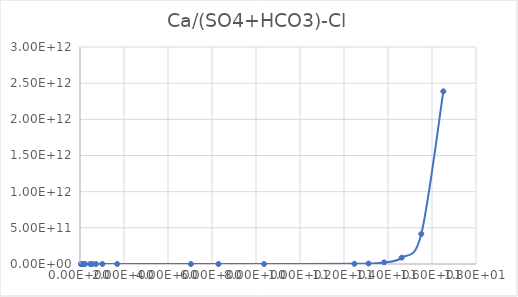
| Category | Series 0 |
|---|---|
| 0.045801 | 2.431 |
| 0.050889 | 2.448 |
| 0.057263 | 2.468 |
| 0.065462 | 2.493 |
| 0.076377 | 2.524 |
| 0.091694 | 2.566 |
| 0.11465 | 2.626 |
| 0.15301 | 2.723 |
| 0.22977 | 2.923 |
| 0.46188 | 3.665 |
| 0.56443 | 4.087 |
| 0.7255 | 4.907 |
| 1.0152 | 7.105 |
| 1.6902 | 20.073 |
| 5.0451 | 10541.626 |
| 6.2946 | 108733.841 |
| 8.3668 | 4452087.848 |
| 12.472 | 2285251757.779 |
| 13.115 | 6611152461.849 |
| 13.828 | 22249975121.261 |
| 14.623 | 88002238387.69 |
| 15.513 | 415049873034.659 |
| 16.516 | 2387305002688.864 |